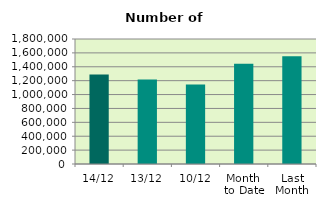
| Category | Series 0 |
|---|---|
| 14/12 | 1290176 |
| 13/12 | 1215610 |
| 10/12 | 1144692 |
| Month 
to Date | 1445081.2 |
| Last
Month | 1553278.182 |